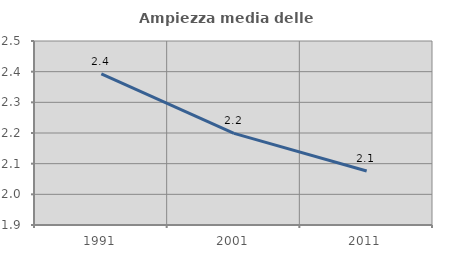
| Category | Ampiezza media delle famiglie |
|---|---|
| 1991.0 | 2.393 |
| 2001.0 | 2.199 |
| 2011.0 | 2.076 |